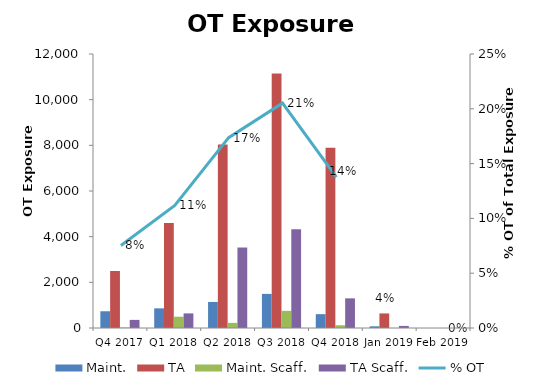
| Category | Maint. | TA | Maint. Scaff. | TA Scaff. |
|---|---|---|---|---|
| Q4 2017 | 733 | 2496 | 21 | 355.5 |
| Q1 2018 | 860.5 | 4596.5 | 494.5 | 639.5 |
| Q2 2018 | 1140.5 | 8033 | 224 | 3525 |
| Q3 2018 | 1493.5 | 11147 | 750.5 | 4319.5 |
| Q4 2018 | 606 | 7892.5 | 121.5 | 1298 |
| Jan 2019 | 74 | 638 | 0 | 90 |
| Feb 2019 | 0 | 0 | 0 | 0 |